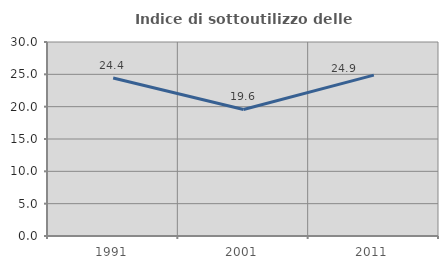
| Category | Indice di sottoutilizzo delle abitazioni  |
|---|---|
| 1991.0 | 24.444 |
| 2001.0 | 19.565 |
| 2011.0 | 24.885 |